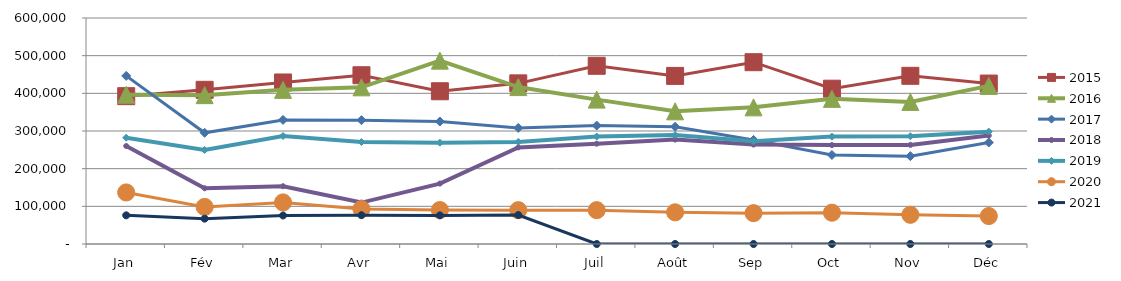
| Category | 2015 | 2016 | 2017 | 2018 | 2019 | 2020 | 2021 |
|---|---|---|---|---|---|---|---|
| Jan | 392455.386 | 396263.914 | 446281.806 | 260114.073 | 282172.738 | 136826.229 | 76108.624 |
| Fév | 409347.179 | 395175.975 | 295222.519 | 148036.843 | 249871.665 | 98396.552 | 67303.114 |
| Mar | 428838.698 | 409222.091 | 329338.872 | 153395.928 | 286777.302 | 110314.836 | 75650.537 |
| Avr | 448014.817 | 415901.642 | 328702.589 | 109982.902 | 270782.686 | 92890.727 | 76451.124 |
| Mai | 405528.286 | 486763.336 | 325158.457 | 160382.707 | 269027.301 | 90121.405 | 75984.328 |
| Juin | 426462.87 | 416602.613 | 308100.463 | 256426.409 | 271108.83 | 89786.547 | 76856.752 |
| Juil | 473107.942 | 383313.72 | 314407.38 | 266269.669 | 285234.508 | 89814.637 | 0 |
| Août | 446267.927 | 352198.565 | 311304.785 | 277231.878 | 289072.19 | 84074.92 | 0 |
| Sep | 482677.503 | 362763.978 | 276260.727 | 263963.731 | 272549.159 | 81924.261 | 0 |
| Oct | 412311.701 | 385353.331 | 236379.756 | 262549.621 | 285123.451 | 83105.986 | 0 |
| Nov | 446526.169 | 377201.543 | 233251.128 | 263155.863 | 286119.242 | 77551.508 | 0 |
| Déc | 425963.85 | 419714.854 | 269424.356 | 287963.859 | 298314.346 | 74219.32 | 0 |